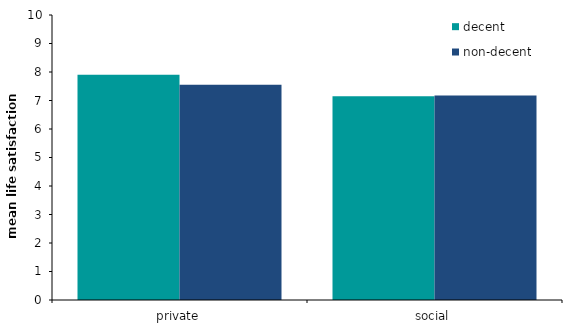
| Category | decent | non-decent |
|---|---|---|
| private | 7.904 | 7.553 |
| social | 7.148 | 7.174 |